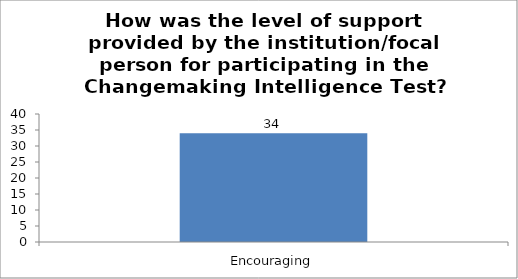
| Category | How was the level of support provided by the institution/focal person for participating in the Changemaking Intelligence Test? |
|---|---|
| Encouraging | 34 |